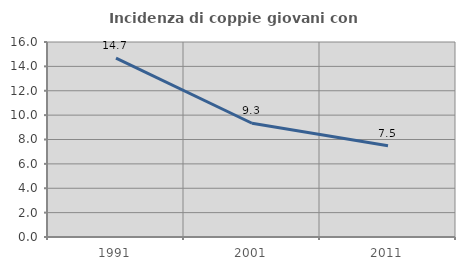
| Category | Incidenza di coppie giovani con figli |
|---|---|
| 1991.0 | 14.684 |
| 2001.0 | 9.333 |
| 2011.0 | 7.483 |